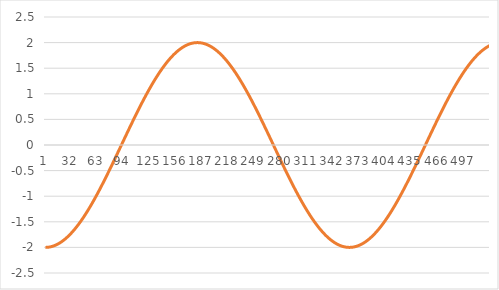
| Category | Series 1 |
|---|---|
| 0 | -2 |
| 1 | -2 |
| 2 | -1.999 |
| 3 | -1.997 |
| 4 | -1.995 |
| 5 | -1.992 |
| 6 | -1.989 |
| 7 | -1.985 |
| 8 | -1.981 |
| 9 | -1.975 |
| 10 | -1.97 |
| 11 | -1.963 |
| 12 | -1.956 |
| 13 | -1.949 |
| 14 | -1.941 |
| 15 | -1.932 |
| 16 | -1.923 |
| 17 | -1.913 |
| 18 | -1.902 |
| 19 | -1.891 |
| 20 | -1.879 |
| 21 | -1.867 |
| 22 | -1.854 |
| 23 | -1.841 |
| 24 | -1.827 |
| 25 | -1.813 |
| 26 | -1.798 |
| 27 | -1.782 |
| 28 | -1.766 |
| 29 | -1.749 |
| 30 | -1.732 |
| 31 | -1.714 |
| 32 | -1.696 |
| 33 | -1.677 |
| 34 | -1.658 |
| 35 | -1.638 |
| 36 | -1.618 |
| 37 | -1.597 |
| 38 | -1.576 |
| 39 | -1.554 |
| 40 | -1.532 |
| 41 | -1.509 |
| 42 | -1.486 |
| 43 | -1.463 |
| 44 | -1.439 |
| 45 | -1.414 |
| 46 | -1.389 |
| 47 | -1.364 |
| 48 | -1.338 |
| 49 | -1.312 |
| 50 | -1.286 |
| 51 | -1.259 |
| 52 | -1.231 |
| 53 | -1.204 |
| 54 | -1.176 |
| 55 | -1.147 |
| 56 | -1.118 |
| 57 | -1.089 |
| 58 | -1.06 |
| 59 | -1.03 |
| 60 | -1 |
| 61 | -0.97 |
| 62 | -0.939 |
| 63 | -0.908 |
| 64 | -0.877 |
| 65 | -0.845 |
| 66 | -0.813 |
| 67 | -0.781 |
| 68 | -0.749 |
| 69 | -0.717 |
| 70 | -0.684 |
| 71 | -0.651 |
| 72 | -0.618 |
| 73 | -0.585 |
| 74 | -0.551 |
| 75 | -0.518 |
| 76 | -0.484 |
| 77 | -0.45 |
| 78 | -0.416 |
| 79 | -0.382 |
| 80 | -0.347 |
| 81 | -0.313 |
| 82 | -0.278 |
| 83 | -0.244 |
| 84 | -0.209 |
| 85 | -0.174 |
| 86 | -0.14 |
| 87 | -0.105 |
| 88 | -0.07 |
| 89 | -0.035 |
| 90 | 0 |
| 91 | 0.035 |
| 92 | 0.07 |
| 93 | 0.105 |
| 94 | 0.14 |
| 95 | 0.174 |
| 96 | 0.209 |
| 97 | 0.244 |
| 98 | 0.278 |
| 99 | 0.313 |
| 100 | 0.347 |
| 101 | 0.382 |
| 102 | 0.416 |
| 103 | 0.45 |
| 104 | 0.484 |
| 105 | 0.518 |
| 106 | 0.551 |
| 107 | 0.585 |
| 108 | 0.618 |
| 109 | 0.651 |
| 110 | 0.684 |
| 111 | 0.717 |
| 112 | 0.749 |
| 113 | 0.781 |
| 114 | 0.813 |
| 115 | 0.845 |
| 116 | 0.877 |
| 117 | 0.908 |
| 118 | 0.939 |
| 119 | 0.97 |
| 120 | 1 |
| 121 | 1.03 |
| 122 | 1.06 |
| 123 | 1.089 |
| 124 | 1.118 |
| 125 | 1.147 |
| 126 | 1.176 |
| 127 | 1.204 |
| 128 | 1.231 |
| 129 | 1.259 |
| 130 | 1.286 |
| 131 | 1.312 |
| 132 | 1.338 |
| 133 | 1.364 |
| 134 | 1.389 |
| 135 | 1.414 |
| 136 | 1.439 |
| 137 | 1.463 |
| 138 | 1.486 |
| 139 | 1.509 |
| 140 | 1.532 |
| 141 | 1.554 |
| 142 | 1.576 |
| 143 | 1.597 |
| 144 | 1.618 |
| 145 | 1.638 |
| 146 | 1.658 |
| 147 | 1.677 |
| 148 | 1.696 |
| 149 | 1.714 |
| 150 | 1.732 |
| 151 | 1.749 |
| 152 | 1.766 |
| 153 | 1.782 |
| 154 | 1.798 |
| 155 | 1.813 |
| 156 | 1.827 |
| 157 | 1.841 |
| 158 | 1.854 |
| 159 | 1.867 |
| 160 | 1.879 |
| 161 | 1.891 |
| 162 | 1.902 |
| 163 | 1.913 |
| 164 | 1.923 |
| 165 | 1.932 |
| 166 | 1.941 |
| 167 | 1.949 |
| 168 | 1.956 |
| 169 | 1.963 |
| 170 | 1.97 |
| 171 | 1.975 |
| 172 | 1.981 |
| 173 | 1.985 |
| 174 | 1.989 |
| 175 | 1.992 |
| 176 | 1.995 |
| 177 | 1.997 |
| 178 | 1.999 |
| 179 | 2 |
| 180 | 2 |
| 181 | 2 |
| 182 | 1.999 |
| 183 | 1.997 |
| 184 | 1.995 |
| 185 | 1.992 |
| 186 | 1.989 |
| 187 | 1.985 |
| 188 | 1.981 |
| 189 | 1.975 |
| 190 | 1.97 |
| 191 | 1.963 |
| 192 | 1.956 |
| 193 | 1.949 |
| 194 | 1.941 |
| 195 | 1.932 |
| 196 | 1.923 |
| 197 | 1.913 |
| 198 | 1.902 |
| 199 | 1.891 |
| 200 | 1.879 |
| 201 | 1.867 |
| 202 | 1.854 |
| 203 | 1.841 |
| 204 | 1.827 |
| 205 | 1.813 |
| 206 | 1.798 |
| 207 | 1.782 |
| 208 | 1.766 |
| 209 | 1.749 |
| 210 | 1.732 |
| 211 | 1.714 |
| 212 | 1.696 |
| 213 | 1.677 |
| 214 | 1.658 |
| 215 | 1.638 |
| 216 | 1.618 |
| 217 | 1.597 |
| 218 | 1.576 |
| 219 | 1.554 |
| 220 | 1.532 |
| 221 | 1.509 |
| 222 | 1.486 |
| 223 | 1.463 |
| 224 | 1.439 |
| 225 | 1.414 |
| 226 | 1.389 |
| 227 | 1.364 |
| 228 | 1.338 |
| 229 | 1.312 |
| 230 | 1.286 |
| 231 | 1.259 |
| 232 | 1.231 |
| 233 | 1.204 |
| 234 | 1.176 |
| 235 | 1.147 |
| 236 | 1.118 |
| 237 | 1.089 |
| 238 | 1.06 |
| 239 | 1.03 |
| 240 | 1 |
| 241 | 0.97 |
| 242 | 0.939 |
| 243 | 0.908 |
| 244 | 0.877 |
| 245 | 0.845 |
| 246 | 0.813 |
| 247 | 0.781 |
| 248 | 0.749 |
| 249 | 0.717 |
| 250 | 0.684 |
| 251 | 0.651 |
| 252 | 0.618 |
| 253 | 0.585 |
| 254 | 0.551 |
| 255 | 0.518 |
| 256 | 0.484 |
| 257 | 0.45 |
| 258 | 0.416 |
| 259 | 0.382 |
| 260 | 0.347 |
| 261 | 0.313 |
| 262 | 0.278 |
| 263 | 0.244 |
| 264 | 0.209 |
| 265 | 0.174 |
| 266 | 0.14 |
| 267 | 0.105 |
| 268 | 0.07 |
| 269 | 0.035 |
| 270 | 0 |
| 271 | -0.035 |
| 272 | -0.07 |
| 273 | -0.105 |
| 274 | -0.14 |
| 275 | -0.174 |
| 276 | -0.209 |
| 277 | -0.244 |
| 278 | -0.278 |
| 279 | -0.313 |
| 280 | -0.347 |
| 281 | -0.382 |
| 282 | -0.416 |
| 283 | -0.45 |
| 284 | -0.484 |
| 285 | -0.518 |
| 286 | -0.551 |
| 287 | -0.585 |
| 288 | -0.618 |
| 289 | -0.651 |
| 290 | -0.684 |
| 291 | -0.717 |
| 292 | -0.749 |
| 293 | -0.781 |
| 294 | -0.813 |
| 295 | -0.845 |
| 296 | -0.877 |
| 297 | -0.908 |
| 298 | -0.939 |
| 299 | -0.97 |
| 300 | -1 |
| 301 | -1.03 |
| 302 | -1.06 |
| 303 | -1.089 |
| 304 | -1.118 |
| 305 | -1.147 |
| 306 | -1.176 |
| 307 | -1.204 |
| 308 | -1.231 |
| 309 | -1.259 |
| 310 | -1.286 |
| 311 | -1.312 |
| 312 | -1.338 |
| 313 | -1.364 |
| 314 | -1.389 |
| 315 | -1.414 |
| 316 | -1.439 |
| 317 | -1.463 |
| 318 | -1.486 |
| 319 | -1.509 |
| 320 | -1.532 |
| 321 | -1.554 |
| 322 | -1.576 |
| 323 | -1.597 |
| 324 | -1.618 |
| 325 | -1.638 |
| 326 | -1.658 |
| 327 | -1.677 |
| 328 | -1.696 |
| 329 | -1.714 |
| 330 | -1.732 |
| 331 | -1.749 |
| 332 | -1.766 |
| 333 | -1.782 |
| 334 | -1.798 |
| 335 | -1.813 |
| 336 | -1.827 |
| 337 | -1.841 |
| 338 | -1.854 |
| 339 | -1.867 |
| 340 | -1.879 |
| 341 | -1.891 |
| 342 | -1.902 |
| 343 | -1.913 |
| 344 | -1.923 |
| 345 | -1.932 |
| 346 | -1.941 |
| 347 | -1.949 |
| 348 | -1.956 |
| 349 | -1.963 |
| 350 | -1.97 |
| 351 | -1.975 |
| 352 | -1.981 |
| 353 | -1.985 |
| 354 | -1.989 |
| 355 | -1.992 |
| 356 | -1.995 |
| 357 | -1.997 |
| 358 | -1.999 |
| 359 | -2 |
| 360 | -2 |
| 361 | -2 |
| 362 | -1.999 |
| 363 | -1.997 |
| 364 | -1.995 |
| 365 | -1.992 |
| 366 | -1.989 |
| 367 | -1.985 |
| 368 | -1.981 |
| 369 | -1.975 |
| 370 | -1.97 |
| 371 | -1.963 |
| 372 | -1.956 |
| 373 | -1.949 |
| 374 | -1.941 |
| 375 | -1.932 |
| 376 | -1.923 |
| 377 | -1.913 |
| 378 | -1.902 |
| 379 | -1.891 |
| 380 | -1.879 |
| 381 | -1.867 |
| 382 | -1.854 |
| 383 | -1.841 |
| 384 | -1.827 |
| 385 | -1.813 |
| 386 | -1.798 |
| 387 | -1.782 |
| 388 | -1.766 |
| 389 | -1.749 |
| 390 | -1.732 |
| 391 | -1.714 |
| 392 | -1.696 |
| 393 | -1.677 |
| 394 | -1.658 |
| 395 | -1.638 |
| 396 | -1.618 |
| 397 | -1.597 |
| 398 | -1.576 |
| 399 | -1.554 |
| 400 | -1.532 |
| 401 | -1.509 |
| 402 | -1.486 |
| 403 | -1.463 |
| 404 | -1.439 |
| 405 | -1.414 |
| 406 | -1.389 |
| 407 | -1.364 |
| 408 | -1.338 |
| 409 | -1.312 |
| 410 | -1.286 |
| 411 | -1.259 |
| 412 | -1.231 |
| 413 | -1.204 |
| 414 | -1.176 |
| 415 | -1.147 |
| 416 | -1.118 |
| 417 | -1.089 |
| 418 | -1.06 |
| 419 | -1.03 |
| 420 | -1 |
| 421 | -0.97 |
| 422 | -0.939 |
| 423 | -0.908 |
| 424 | -0.877 |
| 425 | -0.845 |
| 426 | -0.813 |
| 427 | -0.781 |
| 428 | -0.749 |
| 429 | -0.717 |
| 430 | -0.684 |
| 431 | -0.651 |
| 432 | -0.618 |
| 433 | -0.585 |
| 434 | -0.551 |
| 435 | -0.518 |
| 436 | -0.484 |
| 437 | -0.45 |
| 438 | -0.416 |
| 439 | -0.382 |
| 440 | -0.347 |
| 441 | -0.313 |
| 442 | -0.278 |
| 443 | -0.244 |
| 444 | -0.209 |
| 445 | -0.174 |
| 446 | -0.14 |
| 447 | -0.105 |
| 448 | -0.07 |
| 449 | -0.035 |
| 450 | 0 |
| 451 | 0.035 |
| 452 | 0.07 |
| 453 | 0.105 |
| 454 | 0.14 |
| 455 | 0.174 |
| 456 | 0.209 |
| 457 | 0.244 |
| 458 | 0.278 |
| 459 | 0.313 |
| 460 | 0.347 |
| 461 | 0.382 |
| 462 | 0.416 |
| 463 | 0.45 |
| 464 | 0.484 |
| 465 | 0.518 |
| 466 | 0.551 |
| 467 | 0.585 |
| 468 | 0.618 |
| 469 | 0.651 |
| 470 | 0.684 |
| 471 | 0.717 |
| 472 | 0.749 |
| 473 | 0.781 |
| 474 | 0.813 |
| 475 | 0.845 |
| 476 | 0.877 |
| 477 | 0.908 |
| 478 | 0.939 |
| 479 | 0.97 |
| 480 | 1 |
| 481 | 1.03 |
| 482 | 1.06 |
| 483 | 1.089 |
| 484 | 1.118 |
| 485 | 1.147 |
| 486 | 1.176 |
| 487 | 1.204 |
| 488 | 1.231 |
| 489 | 1.259 |
| 490 | 1.286 |
| 491 | 1.312 |
| 492 | 1.338 |
| 493 | 1.364 |
| 494 | 1.389 |
| 495 | 1.414 |
| 496 | 1.439 |
| 497 | 1.463 |
| 498 | 1.486 |
| 499 | 1.509 |
| 500 | 1.532 |
| 501 | 1.554 |
| 502 | 1.576 |
| 503 | 1.597 |
| 504 | 1.618 |
| 505 | 1.638 |
| 506 | 1.658 |
| 507 | 1.677 |
| 508 | 1.696 |
| 509 | 1.714 |
| 510 | 1.732 |
| 511 | 1.749 |
| 512 | 1.766 |
| 513 | 1.782 |
| 514 | 1.798 |
| 515 | 1.813 |
| 516 | 1.827 |
| 517 | 1.841 |
| 518 | 1.854 |
| 519 | 1.867 |
| 520 | 1.879 |
| 521 | 1.891 |
| 522 | 1.902 |
| 523 | 1.913 |
| 524 | 1.923 |
| 525 | 1.932 |
| 526 | 1.941 |